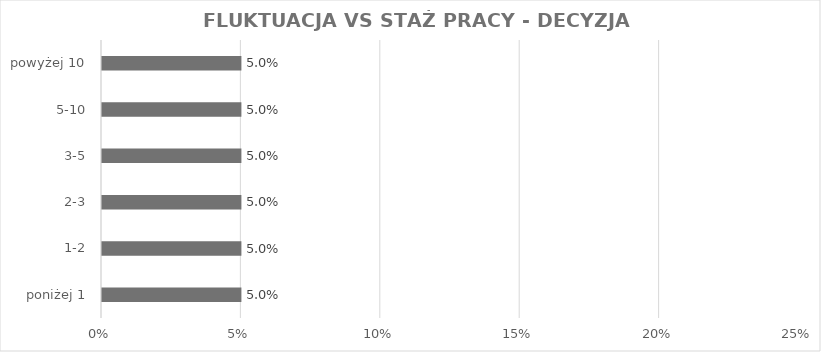
| Category | Series 0 |
|---|---|
| poniżej 1 | 0.05 |
| 1-2 | 0.05 |
| 2-3 | 0.05 |
| 3-5 | 0.05 |
| 5-10 | 0.05 |
| powyżej 10 | 0.05 |